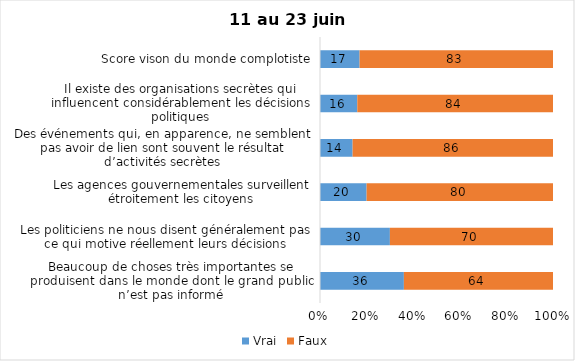
| Category | Vrai | Faux |
|---|---|---|
| Beaucoup de choses très importantes se produisent dans le monde dont le grand public n’est pas informé | 36 | 64 |
| Les politiciens ne nous disent généralement pas ce qui motive réellement leurs décisions | 30 | 70 |
| Les agences gouvernementales surveillent étroitement les citoyens | 20 | 80 |
| Des événements qui, en apparence, ne semblent pas avoir de lien sont souvent le résultat d’activités secrètes | 14 | 86 |
| Il existe des organisations secrètes qui influencent considérablement les décisions politiques | 16 | 84 |
| Score vison du monde complotiste | 17 | 83 |